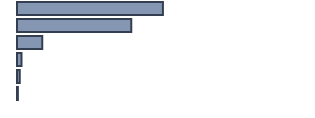
| Category | Percentatge |
|---|---|
| 0 | 49.8 |
| 1 | 39 |
| 2 | 8.6 |
| 3 | 1.5 |
| 4 | 0.9 |
| 5 | 0.3 |